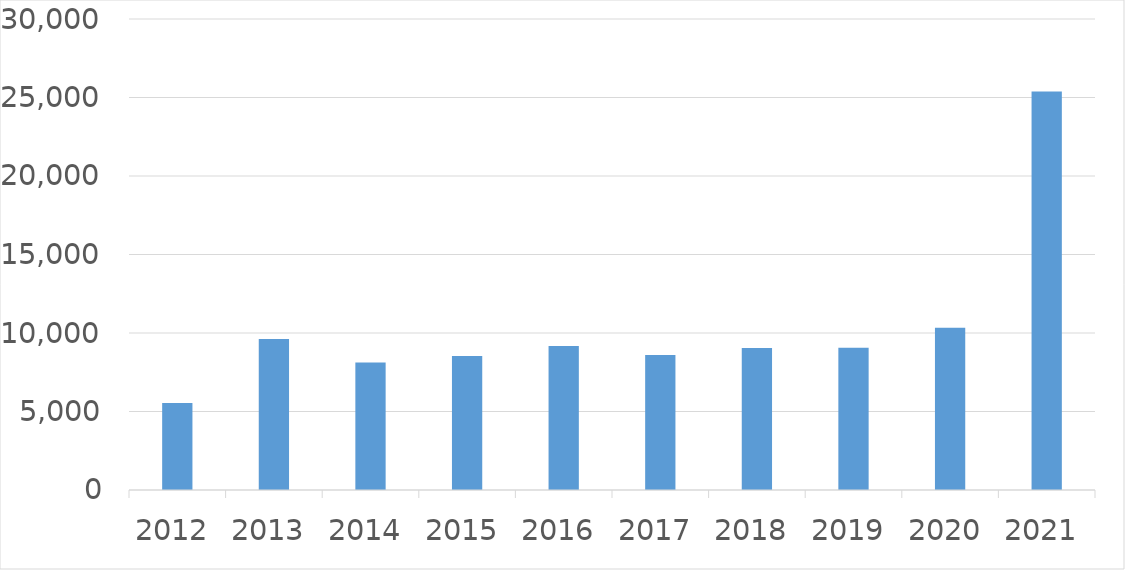
| Category | Series 0 |
|---|---|
| 2012 | 5536 |
| 2013 | 9615 |
| 2014 | 8126 |
| 2015 | 8535 |
| 2016 | 9171 |
| 2017 | 8603 |
| 2018 | 9048 |
| 2019 | 9054 |
| 2020 | 10332 |
| 2021 | 25382 |